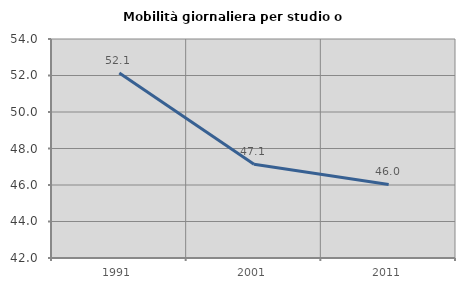
| Category | Mobilità giornaliera per studio o lavoro |
|---|---|
| 1991.0 | 52.139 |
| 2001.0 | 47.138 |
| 2011.0 | 46.029 |